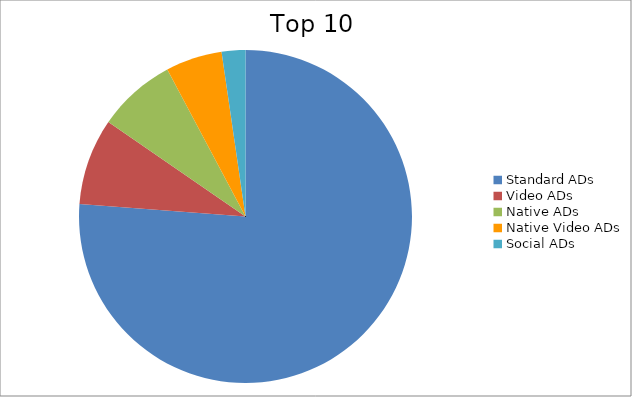
| Category | Series 0 |
|---|---|
| Standard ADs | 76.19 |
| Video ADs | 8.41 |
| Native ADs | 7.62 |
| Native Video ADs | 5.48 |
| Social ADs | 2.3 |